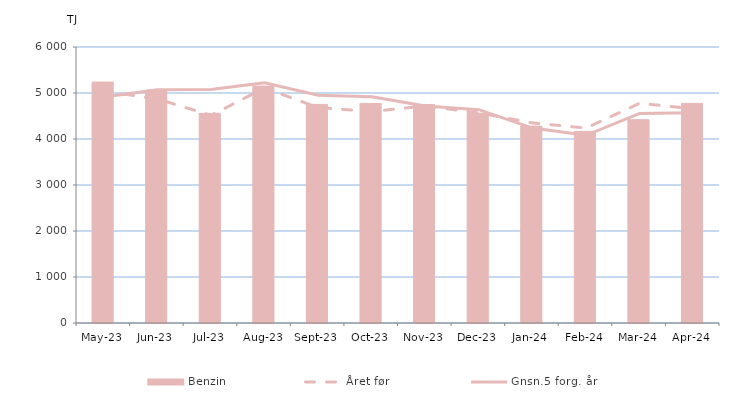
| Category | Benzin |
|---|---|
| 2023-05-01 | 5237.834 |
| 2023-06-01 | 5060.74 |
| 2023-07-01 | 4556.525 |
| 2023-08-01 | 5150.223 |
| 2023-09-01 | 4751.49 |
| 2023-10-01 | 4772.809 |
| 2023-11-01 | 4748.008 |
| 2023-12-01 | 4561.19 |
| 2024-01-01 | 4280.454 |
| 2024-02-01 | 4166.366 |
| 2024-03-01 | 4420.132 |
| 2024-04-01 | 4773.499 |